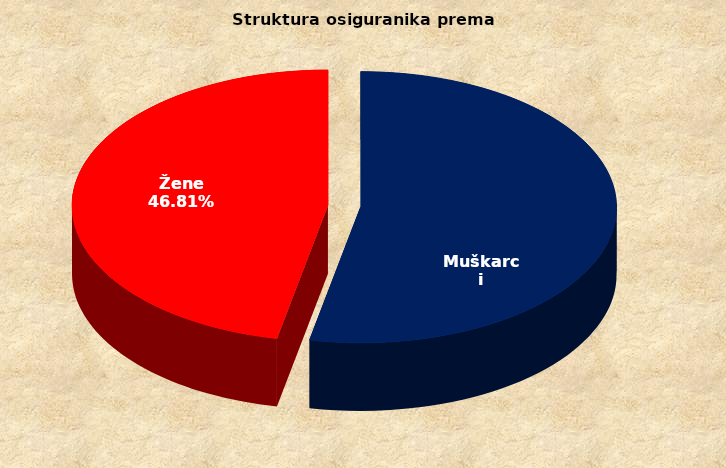
| Category | Series 0 |
|---|---|
| Muškarci | 875841 |
| Žene | 770699 |